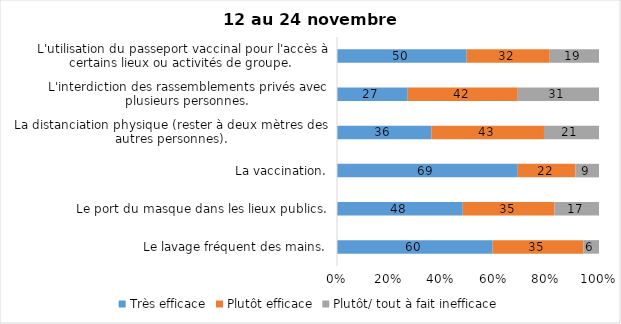
| Category | Très efficace | Plutôt efficace | Plutôt/ tout à fait inefficace |
|---|---|---|---|
| Le lavage fréquent des mains. | 60 | 35 | 6 |
| Le port du masque dans les lieux publics. | 48 | 35 | 17 |
| La vaccination. | 69 | 22 | 9 |
| La distanciation physique (rester à deux mètres des autres personnes). | 36 | 43 | 21 |
| L'interdiction des rassemblements privés avec plusieurs personnes. | 27 | 42 | 31 |
| L'utilisation du passeport vaccinal pour l'accès à certains lieux ou activités de groupe.  | 50 | 32 | 19 |